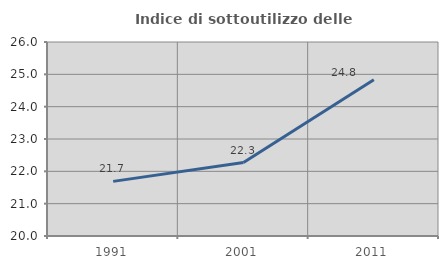
| Category | Indice di sottoutilizzo delle abitazioni  |
|---|---|
| 1991.0 | 21.69 |
| 2001.0 | 22.271 |
| 2011.0 | 24.831 |